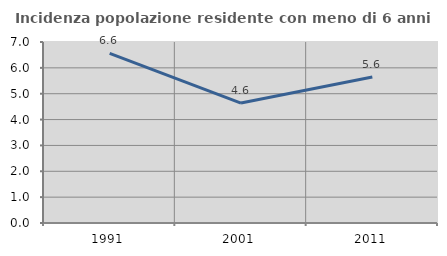
| Category | Incidenza popolazione residente con meno di 6 anni |
|---|---|
| 1991.0 | 6.563 |
| 2001.0 | 4.637 |
| 2011.0 | 5.647 |